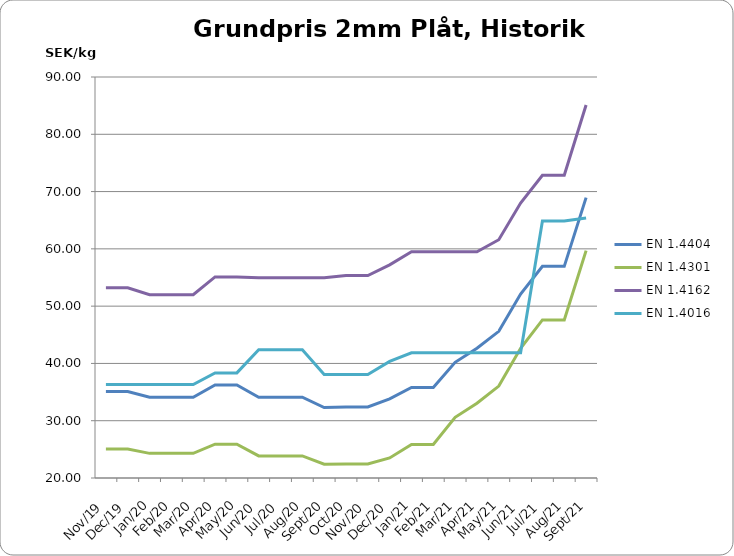
| Category | EN 1.4404 | EN 1.4301 | EN 1.4162  | EN 1.4016 |
|---|---|---|---|---|
| 2019-11-15 | 35.1 | 25.05 | 53.2 | 36.3 |
| 2019-12-15 | 35.1 | 25.05 | 53.2 | 36.3 |
| 2020-01-15 | 34.1 | 24.3 | 52 | 36.3 |
| 2020-02-15 | 34.1 | 24.3 | 52 | 36.3 |
| 2020-03-15 | 34.1 | 24.3 | 52 | 36.3 |
| 2020-04-26 | 36.25 | 25.9 | 55.1 | 38.35 |
| 2020-05-26 | 36.25 | 25.9 | 55.1 | 38.35 |
| 2020-06-26 | 34.1 | 23.85 | 54.95 | 42.4 |
| 2020-07-26 | 34.1 | 23.85 | 54.95 | 42.4 |
| 2020-08-26 | 34.1 | 23.85 | 54.95 | 42.4 |
| 2020-09-26 | 32.3 | 22.4 | 54.95 | 38.05 |
| 2020-10-26 | 32.4 | 22.45 | 55.35 | 38.05 |
| 2020-11-26 | 32.4 | 22.45 | 55.35 | 38.05 |
| 2020-12-26 | 33.8 | 23.5 | 57.2 | 40.35 |
| 2021-01-26 | 35.8 | 25.85 | 59.5 | 41.85 |
| 2021-02-26 | 35.8 | 25.85 | 59.5 | 41.85 |
| 2021-03-26 | 40.2 | 30.6 | 59.5 | 41.85 |
| 2021-04-26 | 42.65 | 33.05 | 59.5 | 41.85 |
| 2021-05-26 | 45.6 | 36.05 | 61.6 | 41.85 |
| 2021-06-26 | 52.1 | 42.65 | 68 | 41.85 |
| 2021-07-26 | 56.95 | 47.6 | 72.85 | 64.85 |
| 2021-08-26 | 56.95 | 47.6 | 72.85 | 64.85 |
| 2021-09-26 | 68.95 | 59.7 | 85.1 | 65.4 |